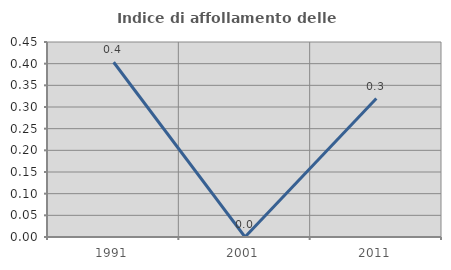
| Category | Indice di affollamento delle abitazioni  |
|---|---|
| 1991.0 | 0.403 |
| 2001.0 | 0 |
| 2011.0 | 0.319 |